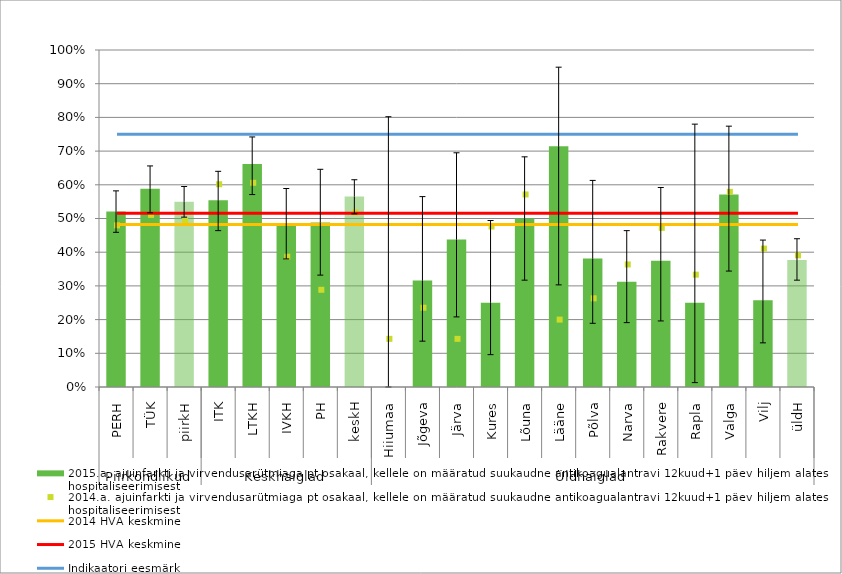
| Category | 2015.a. ajuinfarkti ja virvendusarütmiaga pt osakaal, kellele on määratud suukaudne antikoagualantravi 12kuud+1 päev hiljem alates hospitaliseerimisest |
|---|---|
| 0 | 0.521 |
| 1 | 0.588 |
| 2 | 0.55 |
| 3 | 0.554 |
| 4 | 0.661 |
| 5 | 0.484 |
| 6 | 0.488 |
| 7 | 0.565 |
| 8 | 0 |
| 9 | 0.316 |
| 10 | 0.438 |
| 11 | 0.25 |
| 12 | 0.5 |
| 13 | 0.714 |
| 14 | 0.381 |
| 15 | 0.312 |
| 16 | 0.375 |
| 17 | 0.25 |
| 18 | 0.571 |
| 19 | 0.257 |
| 20 | 0.377 |